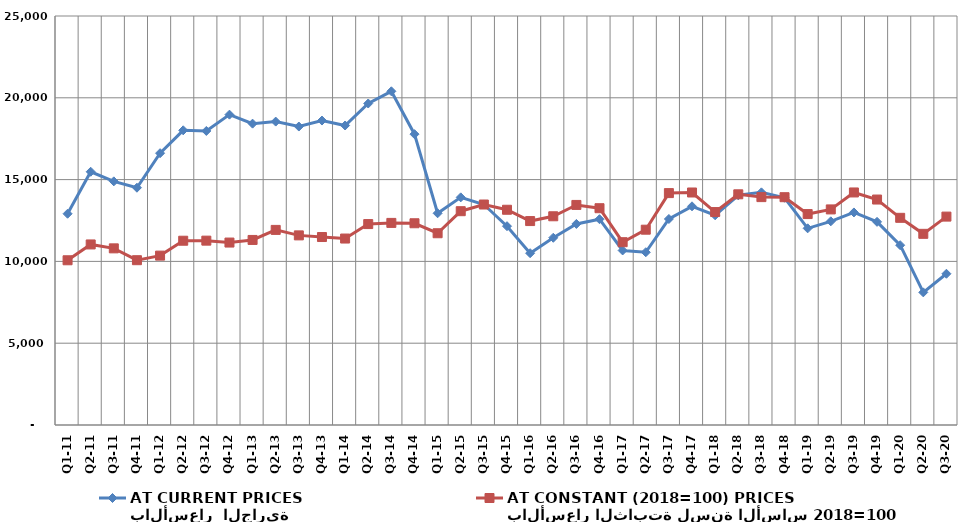
| Category | بالأسعار  الجارية 
AT CURRENT PRICES | بالأسعار الثابتة لسنة الأساس 2018=100
AT CONSTANT (2018=100) PRICES |
|---|---|---|
| Q1-11 | 12912.907 | 10068.869 |
| Q2-11 | 15479.199 | 11036.204 |
| Q3-11 | 14892.66 | 10797.142 |
| Q4-11 | 14504.238 | 10074.111 |
| Q1-12 | 16614.74 | 10353.078 |
| Q2-12 | 18012.764 | 11263.356 |
| Q3-12 | 17973.109 | 11268.506 |
| Q4-12 | 18970.409 | 11151.958 |
| Q1-13 | 18420.268 | 11311.118 |
| Q2-13 | 18546.036 | 11925.266 |
| Q3-13 | 18243.599 | 11590.597 |
| Q4-13 | 18609.796 | 11489.62 |
| Q1-14 | 18307.172 | 11397.125 |
| Q2-14 | 19651.76 | 12281.462 |
| Q3-14 | 20397.095 | 12353.163 |
| Q4-14 | 17776.805 | 12331.209 |
| Q1-15 | 12941.758 | 11720.853 |
| Q2-15 | 13914.764 | 13068.79 |
| Q3-15 | 13480.342 | 13476.366 |
| Q4-15 | 12151.815 | 13157.091 |
| Q1-16 | 10501.506 | 12465.232 |
| Q2-16 | 11444.689 | 12758.677 |
| Q3-16 | 12289.243 | 13451.479 |
| Q4-16 | 12578.39 | 13251.377 |
| Q1-17 | 10668.877 | 11173.828 |
| Q2-17 | 10560.003 | 11938.003 |
| Q3-17 | 12593.519 | 14175.115 |
| Q4-17 | 13366.273 | 14212.124 |
| Q1-18 | 12820.693 | 13015.892 |
| Q2-18 | 14040.866 | 14101.275 |
| Q3-18 | 14220.551 | 13929.711 |
| Q4-18 | 13889.452 | 13924.683 |
| Q1-19 | 12021.432 | 12893.311 |
| Q2-19 | 12449.429 | 13177.366 |
| Q3-19 | 12992.238 | 14214.263 |
| Q4-19 | 12418.423 | 13781.141 |
| Q1-20 | 10990.018 | 12663.57 |
| Q2-20 | 8107.631 | 11685.106 |
| Q3-20 | 9244.439 | 12737.991 |